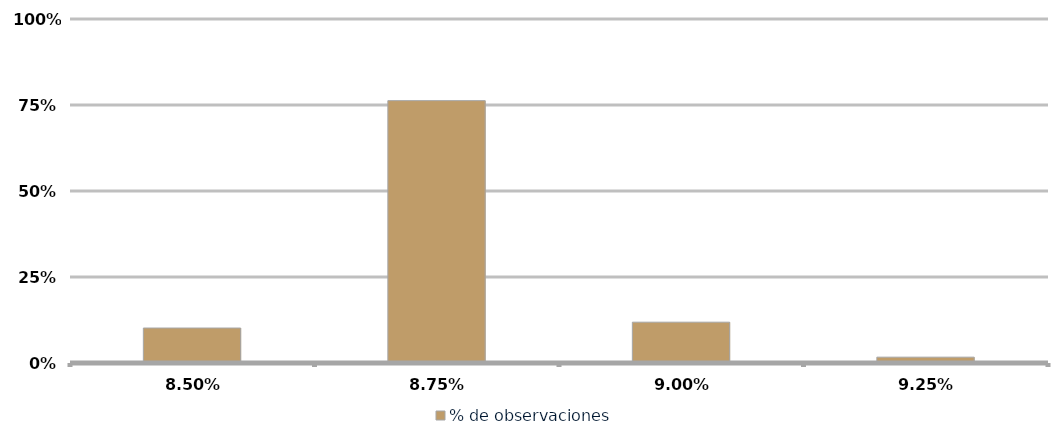
| Category | % de observaciones  |
|---|---|
| 0.085 | 0.102 |
| 0.08750000000000001 | 0.763 |
| 0.09000000000000001 | 0.119 |
| 0.09250000000000001 | 0.017 |